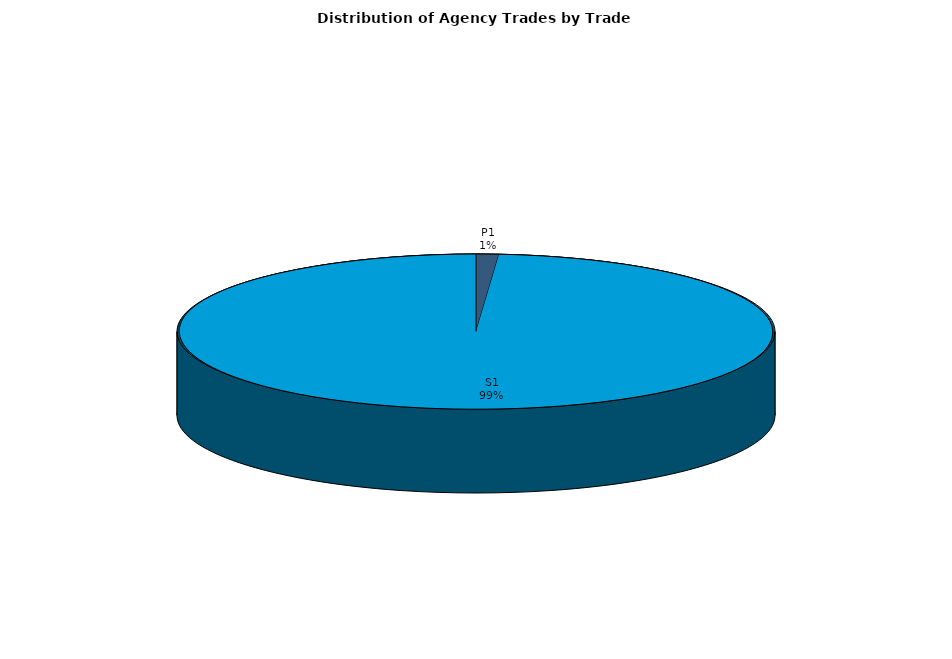
| Category | Series 0 |
|---|---|
| P1 | 24 |
| S1 | 1931 |